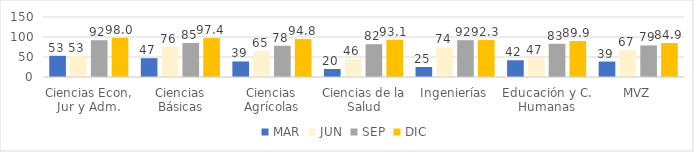
| Category | MAR | JUN | SEP | DIC |
|---|---|---|---|---|
| Ciencias Econ, Jur y Adm. | 53 | 53 | 92 | 98 |
| Ciencias Básicas | 47.1 | 76.1 | 85 | 97.4 |
| Ciencias Agrícolas | 38.8 | 64.8 | 78 | 94.8 |
| Ciencias de la Salud | 20 | 45.7 | 82 | 93.1 |
| Ingenierías | 25 | 74.3 | 92 | 92.3 |
| Educación y C. Humanas | 41.8 | 46.8 | 83 | 89.9 |
| MVZ | 38.6 | 67 | 79 | 84.9 |